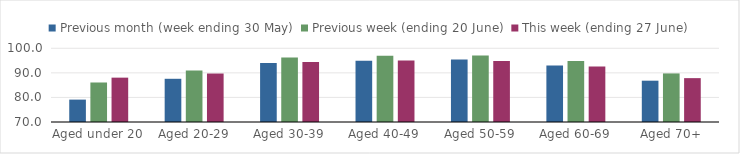
| Category | Previous month (week ending 30 May) | Previous week (ending 20 June) | This week (ending 27 June) |
|---|---|---|---|
| Aged under 20 | 79.112 | 86.078 | 88.052 |
| Aged 20-29 | 87.585 | 90.983 | 89.728 |
| Aged 30-39 | 93.99 | 96.299 | 94.429 |
| Aged 40-49 | 94.958 | 96.961 | 95.06 |
| Aged 50-59 | 95.392 | 97.096 | 94.849 |
| Aged 60-69 | 92.957 | 94.871 | 92.608 |
| Aged 70+ | 86.813 | 89.769 | 87.852 |